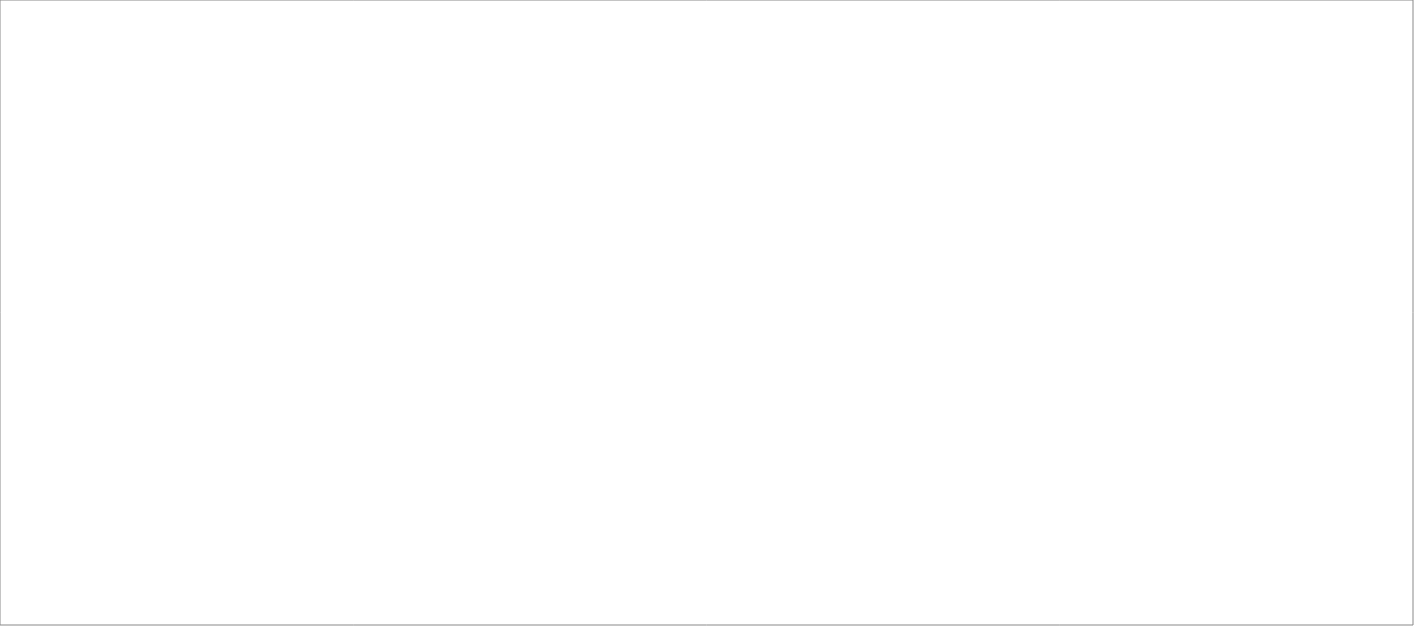
| Category | Total |
|---|---|
| Poolia Sverige AB | 85 |
| Randstad AB | 80 |
| Pro Astri AB | 65 |
| Wise Professionals AB | 65 |
| Experis AB | 45 |